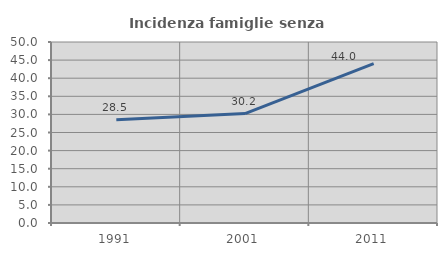
| Category | Incidenza famiglie senza nuclei |
|---|---|
| 1991.0 | 28.504 |
| 2001.0 | 30.233 |
| 2011.0 | 44.032 |